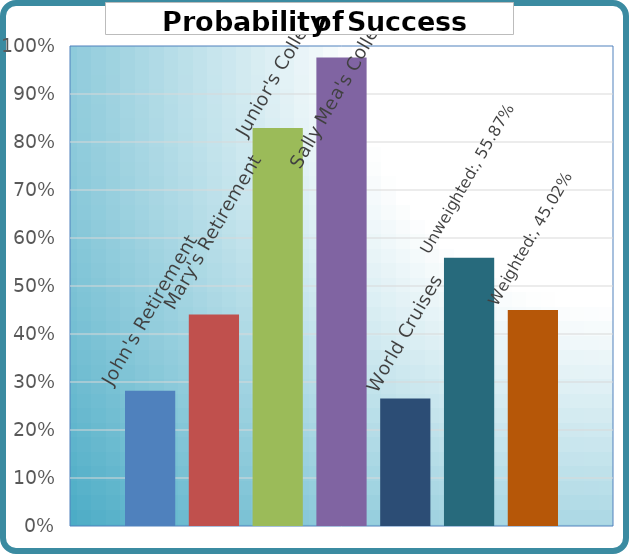
| Category | John's Retirement | Mary's Retirement | Junior's College | Sally Mea's College |   | World Cruises | Unweighted: | Weighted: |
|---|---|---|---|---|---|---|---|---|
| 0 | 0.282 | 0.44 | 0.829 | 0.976 |  | 0.266 | 0.559 | 0.45 |